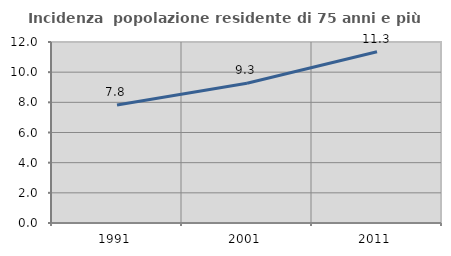
| Category | Incidenza  popolazione residente di 75 anni e più |
|---|---|
| 1991.0 | 7.829 |
| 2001.0 | 9.261 |
| 2011.0 | 11.348 |